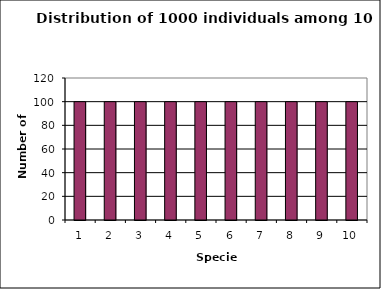
| Category | Series 1 |
|---|---|
| 0 | 100 |
| 1 | 100 |
| 2 | 100 |
| 3 | 100 |
| 4 | 100 |
| 5 | 100 |
| 6 | 100 |
| 7 | 100 |
| 8 | 100 |
| 9 | 100 |